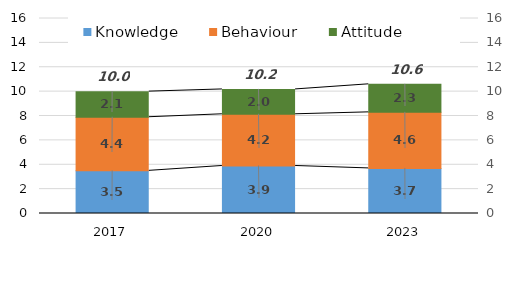
| Category | Knowledge | Behaviour | Attitude |
|---|---|---|---|
| 2017.0 | 3.5 | 4.4 | 2.1 |
| 2020.0 | 3.9 | 4.24 | 2.04 |
| 2023.0 | 3.7 | 4.6 | 2.3 |